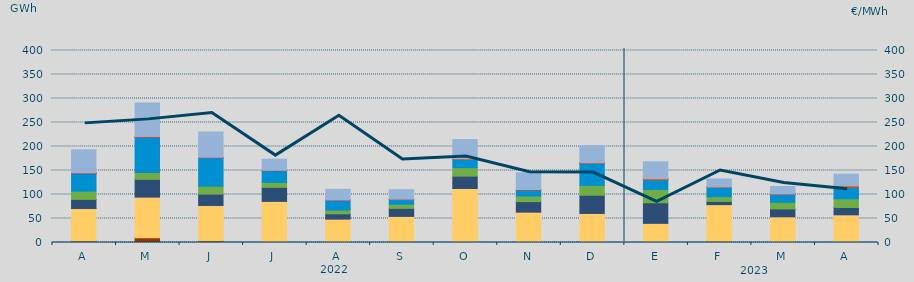
| Category | Carbón | Ciclo Combinado | Cogeneración | Consumo Bombeo | Eólica | Hidráulica | Nuclear | Otras Renovables | Solar fotovoltaica | Solar térmica | Turbinación bombeo |
|---|---|---|---|---|---|---|---|---|---|---|---|
| A | 3349.534 | 67415.187 | 93.591 | 18989.102 | 17056.874 | 36445.011 | 1248.7 | 45.8 | 106.634 | 333.066 | 48166.851 |
| M | 10012.495 | 84316.131 | 342.191 | 36920.803 | 14355.123 | 73448.126 | 0.3 | 0 | 350.4 | 549.325 | 70399.534 |
| J | 3803.776 | 72994.164 | 408.816 | 23523.459 | 16484.811 | 59296.475 | 327.825 | 3.325 | 281.65 | 342.175 | 52808.788 |
| J | 2026.357 | 83630.229 | 62.5 | 29193.443 | 10247.658 | 24517.982 | 107.35 | 0 | 186.925 | 340.15 | 23284.195 |
| A | 608.425 | 48201.184 | 25.75 | 10881.743 | 7912.923 | 20661.25 | 49.5 | 8.225 | 251.425 | 88.725 | 21982.08 |
| S | 2432.475 | 52018.85 | 0.5 | 16627 | 8549.825 | 9810.3 | 0 | 23 | 777.175 | 6.75 | 19642.325 |
| O | 1876.1 | 110603.205 | 45 | 25745.4 | 17659.375 | 17006.05 | 12.825 | 16.6 | 1409.775 | 15.5 | 40055.836 |
| N | 1396.025 | 61724.955 | 198.008 | 21869.975 | 11579.495 | 12449.175 | 266.725 | 0 | 996.225 | 0 | 34713.224 |
| D | 1126.208 | 59335.684 | 104.85 | 37837.8 | 20596.98 | 45465.168 | 544.3 | 0 | 1011.875 | 1.5 | 35471.986 |
| E | 478.95 | 39423.05 | 26.617 | 42912.617 | 27499.217 | 20419.292 | 13.625 | 0 | 2540.742 | 1.5 | 34818.533 |
| F | 2850.925 | 76083.275 | 1.55 | 6739.65 | 9661.175 | 19240.1 | 0 | 0 | 962.675 | 47.25 | 16781.025 |
| M | 1195.025 | 52392.533 | 3.3 | 16393.158 | 13789.6 | 16980.517 | 40.625 | 4.5 | 911.6 | 43.15 | 14940.475 |
| A | 218.875 | 57485.65 | 46.225 | 15258.175 | 18096.25 | 24086.65 | 63.45 | 0 | 3316.075 | 0 | 23819.559 |